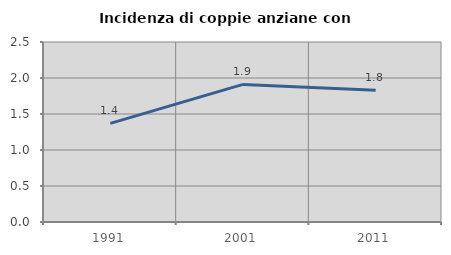
| Category | Incidenza di coppie anziane con figli |
|---|---|
| 1991.0 | 1.37 |
| 2001.0 | 1.911 |
| 2011.0 | 1.829 |